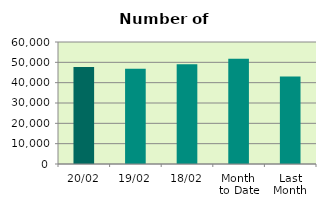
| Category | Series 0 |
|---|---|
| 20/02 | 47694 |
| 19/02 | 46860 |
| 18/02 | 49020 |
| Month 
to Date | 51705.429 |
| Last
Month | 43047.455 |